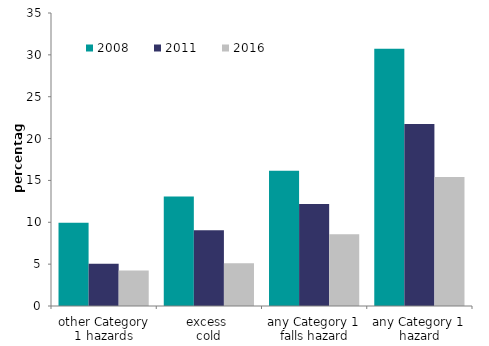
| Category | 2008 | 2011 | 2016 |
|---|---|---|---|
| other Category 1 hazards | 9.948 | 5.05 | 4.254 |
| excess 
cold | 13.08 | 9.054 | 5.115 |
| any Category 1 
falls hazard | 16.151 | 12.18 | 8.558 |
| any Category 1 
hazard | 30.735 | 21.754 | 15.395 |